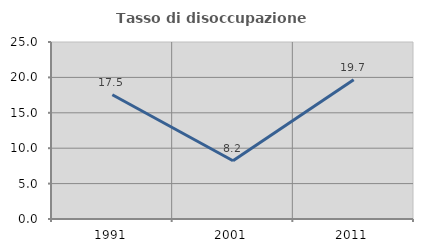
| Category | Tasso di disoccupazione giovanile  |
|---|---|
| 1991.0 | 17.544 |
| 2001.0 | 8.219 |
| 2011.0 | 19.672 |